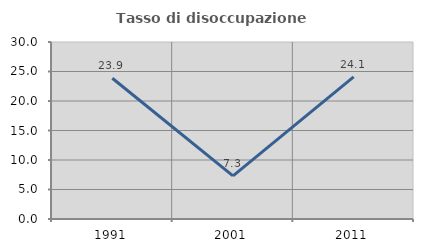
| Category | Tasso di disoccupazione giovanile  |
|---|---|
| 1991.0 | 23.853 |
| 2001.0 | 7.317 |
| 2011.0 | 24.096 |